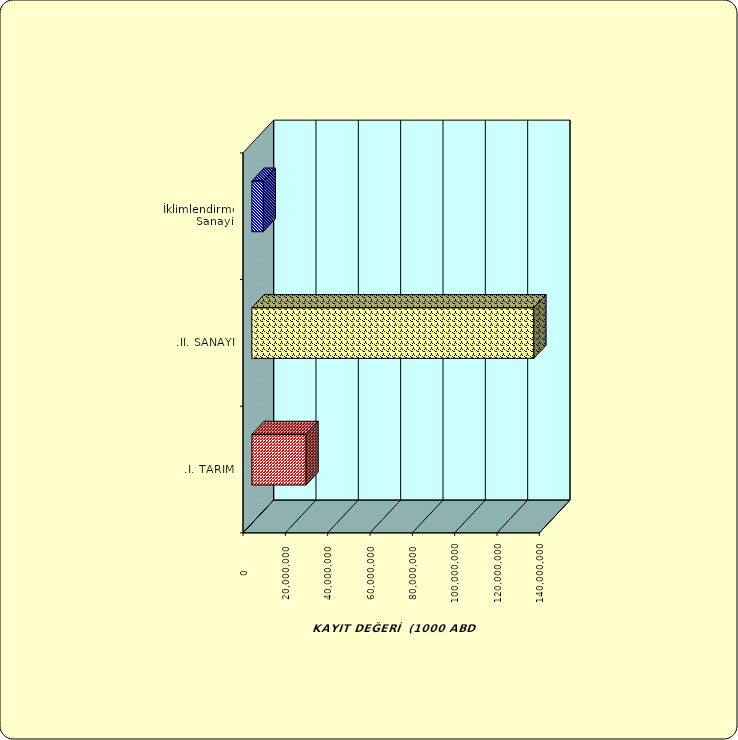
| Category | Series 0 |
|---|---|
| .I. TARIM | 25576184.954 |
| .II. SANAYİ | 133206776.366 |
|  İklimlendirme Sanayii | 5359365.06 |